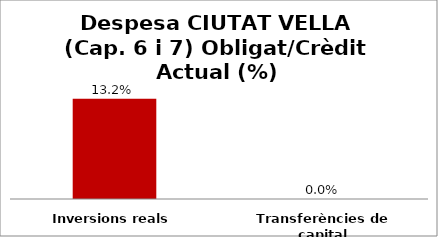
| Category | Series 0 |
|---|---|
| Inversions reals | 0.132 |
| Transferències de capital | 0 |